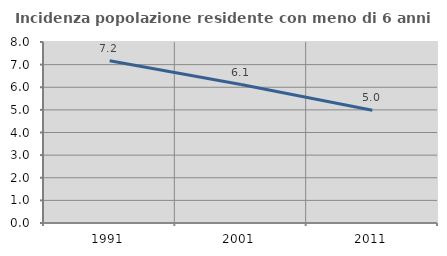
| Category | Incidenza popolazione residente con meno di 6 anni |
|---|---|
| 1991.0 | 7.17 |
| 2001.0 | 6.118 |
| 2011.0 | 4.985 |